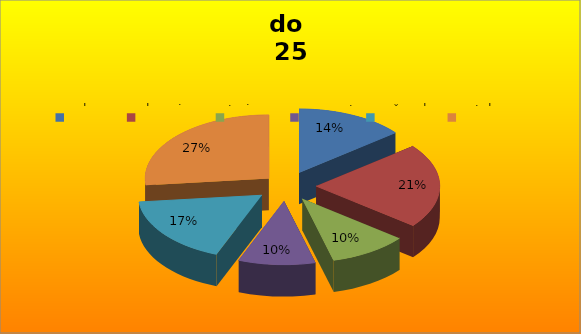
| Category | do 
25 god. |
|---|---|
| zabava | 1036 |
| shopping  | 1563 |
| turizam | 749 |
| znanost | 732 |
| računala | 1263 |
| ostalo | 1946 |